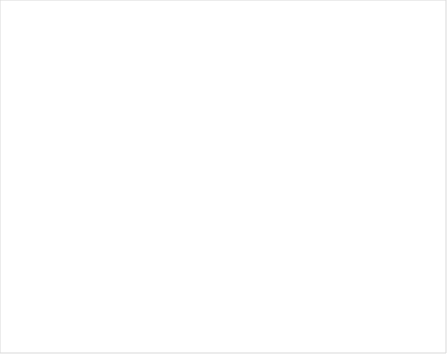
| Category | Total |
|---|---|
| 😁 | 68 |
| 🙂 | 30 |
| 😐 | 11 |
| ☹️ | 8 |